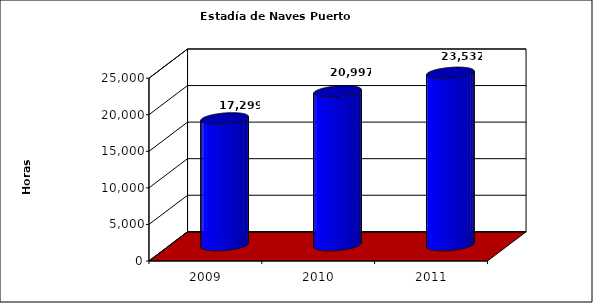
| Category | Series 0 |
|---|---|
| 2009.0 | 17298.62 |
| 2010.0 | 20997 |
| 2011.0 | 23532 |